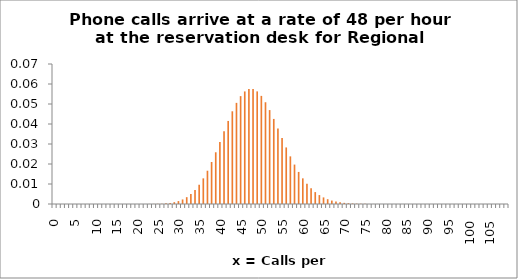
| Category | P(x) |
|---|---|
| 0.0 | 0 |
| 1.0 | 0 |
| 2.0 | 0 |
| 3.0 | 0 |
| 4.0 | 0 |
| 5.0 | 0 |
| 6.0 | 0 |
| 7.0 | 0 |
| 8.0 | 0 |
| 9.0 | 0 |
| 10.0 | 0 |
| 11.0 | 0 |
| 12.0 | 0 |
| 13.0 | 0 |
| 14.0 | 0 |
| 15.0 | 0 |
| 16.0 | 0 |
| 17.0 | 0 |
| 18.0 | 0 |
| 19.0 | 0 |
| 20.0 | 0 |
| 21.0 | 0 |
| 22.0 | 0 |
| 23.0 | 0 |
| 24.0 | 0 |
| 25.0 | 0 |
| 26.0 | 0 |
| 27.0 | 0 |
| 28.0 | 0.001 |
| 29.0 | 0.001 |
| 30.0 | 0.001 |
| 31.0 | 0.002 |
| 32.0 | 0.003 |
| 33.0 | 0.005 |
| 34.0 | 0.007 |
| 35.0 | 0.01 |
| 36.0 | 0.013 |
| 37.0 | 0.017 |
| 38.0 | 0.021 |
| 39.0 | 0.026 |
| 40.0 | 0.031 |
| 41.0 | 0.036 |
| 42.0 | 0.042 |
| 43.0 | 0.046 |
| 44.0 | 0.051 |
| 45.0 | 0.054 |
| 46.0 | 0.056 |
| 47.0 | 0.057 |
| 48.0 | 0.057 |
| 49.0 | 0.056 |
| 50.0 | 0.054 |
| 51.0 | 0.051 |
| 52.0 | 0.047 |
| 53.0 | 0.043 |
| 54.0 | 0.038 |
| 55.0 | 0.033 |
| 56.0 | 0.028 |
| 57.0 | 0.024 |
| 58.0 | 0.02 |
| 59.0 | 0.016 |
| 60.0 | 0.013 |
| 61.0 | 0.01 |
| 62.0 | 0.008 |
| 63.0 | 0.006 |
| 64.0 | 0.004 |
| 65.0 | 0.003 |
| 66.0 | 0.002 |
| 67.0 | 0.002 |
| 68.0 | 0.001 |
| 69.0 | 0.001 |
| 70.0 | 0.001 |
| 71.0 | 0 |
| 72.0 | 0 |
| 73.0 | 0 |
| 74.0 | 0 |
| 75.0 | 0 |
| 76.0 | 0 |
| 77.0 | 0 |
| 78.0 | 0 |
| 79.0 | 0 |
| 80.0 | 0 |
| 81.0 | 0 |
| 82.0 | 0 |
| 83.0 | 0 |
| 84.0 | 0 |
| 85.0 | 0 |
| 86.0 | 0 |
| 87.0 | 0 |
| 88.0 | 0 |
| 89.0 | 0 |
| 90.0 | 0 |
| 91.0 | 0 |
| 92.0 | 0 |
| 93.0 | 0 |
| 94.0 | 0 |
| 95.0 | 0 |
| 96.0 | 0 |
| 97.0 | 0 |
| 98.0 | 0 |
| 99.0 | 0 |
| 100.0 | 0 |
| 101.0 | 0 |
| 102.0 | 0 |
| 103.0 | 0 |
| 104.0 | 0 |
| 105.0 | 0 |
| 106.0 | 0 |
| 107.0 | 0 |
| 108.0 | 0 |
| 109.0 | 0 |